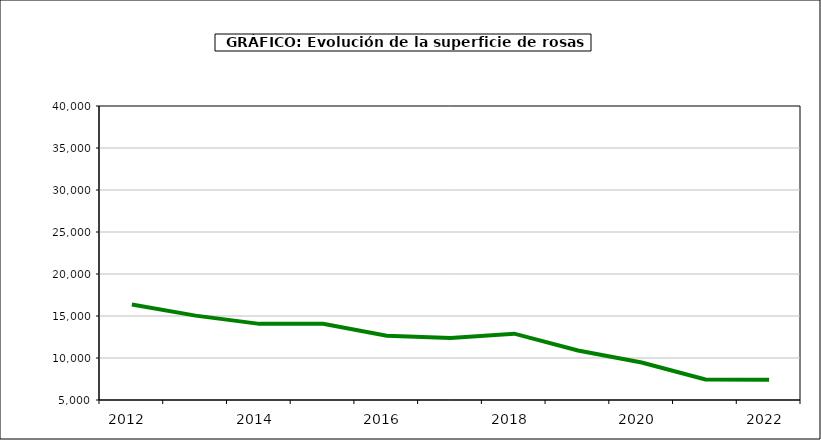
| Category | superficie |
|---|---|
| 2012.0 | 16373 |
| 2013.0 | 15043 |
| 2014.0 | 14063 |
| 2015.0 | 14086 |
| 2016.0 | 12651 |
| 2017.0 | 12371 |
| 2018.0 | 12895 |
| 2019.0 | 10892 |
| 2020.0 | 9459 |
| 2021.0 | 7447 |
| 2022.0 | 7406 |